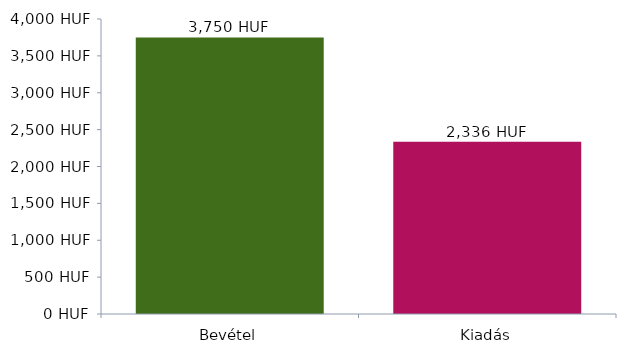
| Category | Diagramadatok |
|---|---|
| 0 | 3750 |
| 1 | 2336 |